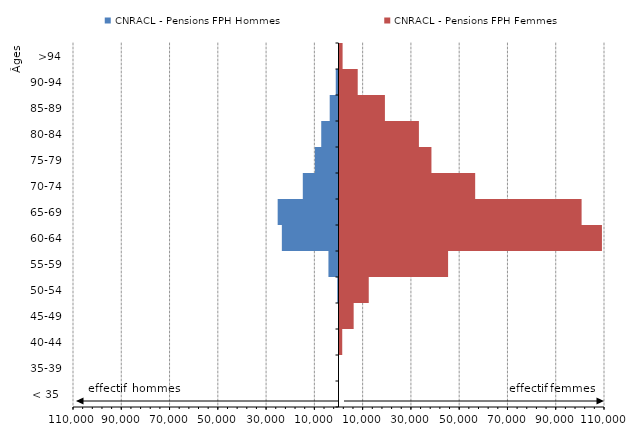
| Category | CNRACL - Pensions FPH Hommes | CNRACL - Pensions FPH Femmes |
|---|---|---|
| < 35  | -2 | 22 |
| 35-39 | -26 | 129 |
| 40-44 | -85 | 1546 |
| 45-49 | -208 | 6279 |
| 50-54 | -506 | 12533 |
| 55-59 | -4170 | 45406 |
| 60-64 | -23471 | 109150 |
| 65-69 | -25203 | 100718 |
| 70-74 | -14790 | 56625 |
| 75-79 | -9774 | 38506 |
| 80-84 | -7154 | 33316 |
| 85-89 | -3647 | 19230 |
| 90-94 | -1137 | 7962 |
| >94 | -197 | 1694 |